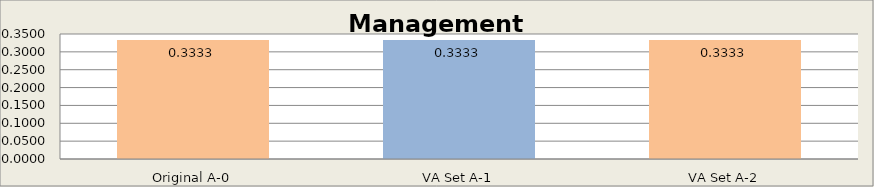
| Category | Management Module |
|---|---|
| Original A-0 | 0.333 |
| VA Set A-1 | 0.333 |
| VA Set A-2 | 0.333 |